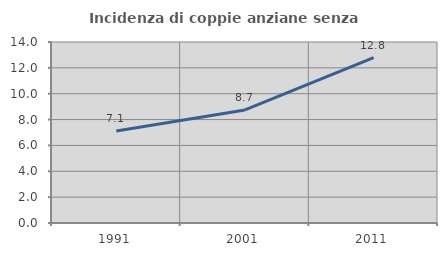
| Category | Incidenza di coppie anziane senza figli  |
|---|---|
| 1991.0 | 7.115 |
| 2001.0 | 8.743 |
| 2011.0 | 12.79 |